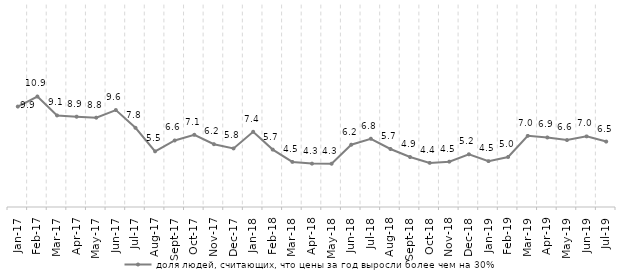
| Category | доля людей, считающих, что цены за год выросли более чем на 30% |
|---|---|
| 2017-01-01 | 9.946 |
| 2017-02-01 | 10.942 |
| 2017-03-01 | 9.066 |
| 2017-04-01 | 8.939 |
| 2017-05-01 | 8.844 |
| 2017-06-01 | 9.6 |
| 2017-07-01 | 7.841 |
| 2017-08-01 | 5.509 |
| 2017-09-01 | 6.587 |
| 2017-10-01 | 7.147 |
| 2017-11-01 | 6.218 |
| 2017-12-01 | 5.8 |
| 2018-01-01 | 7.445 |
| 2018-02-01 | 5.682 |
| 2018-03-01 | 4.463 |
| 2018-04-01 | 4.296 |
| 2018-05-01 | 4.287 |
| 2018-06-01 | 6.164 |
| 2018-07-01 | 6.758 |
| 2018-08-01 | 5.744 |
| 2018-09-01 | 4.946 |
| 2018-10-01 | 4.368 |
| 2018-11-01 | 4.491 |
| 2018-12-01 | 5.219 |
| 2019-01-01 | 4.543 |
| 2019-02-01 | 4.953 |
| 2019-03-01 | 7.044 |
| 2019-04-01 | 6.883 |
| 2019-05-01 | 6.627 |
| 2019-06-01 | 6.991 |
| 2019-07-01 | 6.476 |